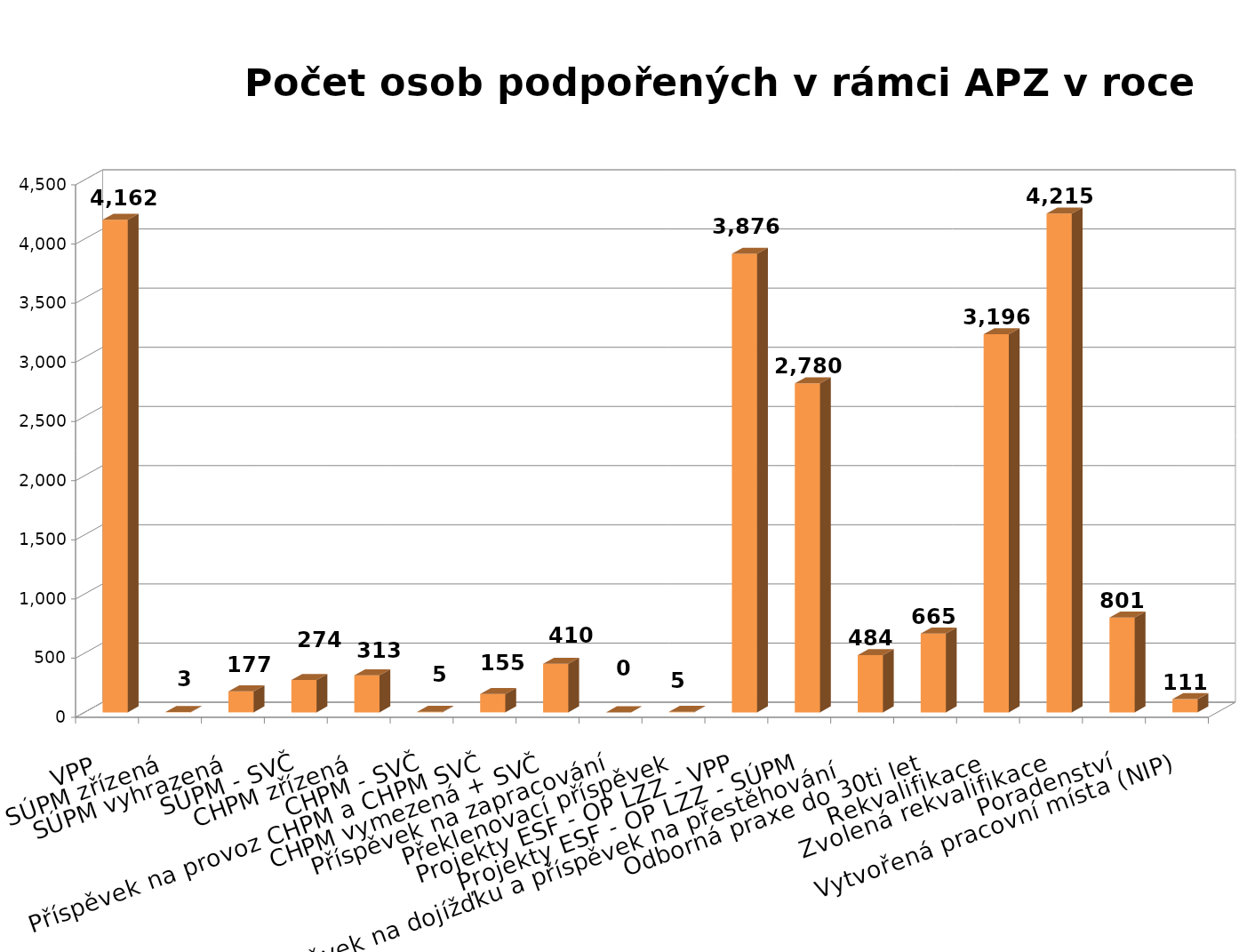
| Category | Series 0 |
|---|---|
| VPP | 4162 |
| SÚPM zřízená | 3 |
| SÚPM vyhrazená | 177 |
| SÚPM - SVČ | 274 |
| CHPM zřízená | 313 |
| CHPM - SVČ | 5 |
| Příspěvek na provoz CHPM a CHPM SVČ | 155 |
| CHPM vymezená + SVČ | 410 |
| Příspěvek na zapracování | 0 |
| Překlenovací příspěvek | 5 |
| Projekty ESF - OP LZZ - VPP | 3876 |
| Projekty ESF - OP LZZ - SÚPM | 2780 |
| Příspěvek na dojížďku a příspěvek na přestěhování      | 484 |
| Odborná praxe do 30ti let | 665 |
| Rekvalifikace | 3196 |
| Zvolená rekvalifikace | 4215 |
| Poradenství | 801 |
| Vytvořená pracovní místa (NIP) | 111 |